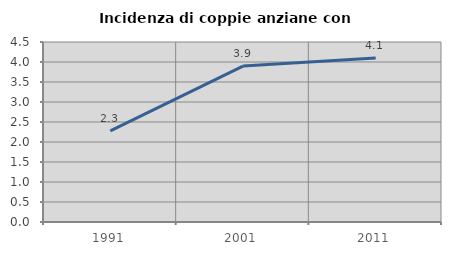
| Category | Incidenza di coppie anziane con figli |
|---|---|
| 1991.0 | 2.276 |
| 2001.0 | 3.897 |
| 2011.0 | 4.098 |